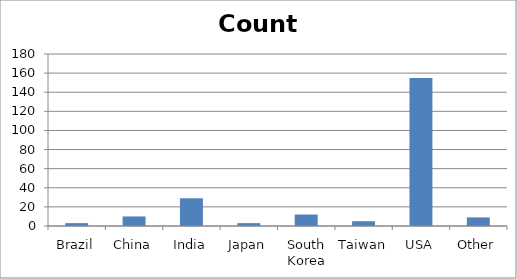
| Category | Count |
|---|---|
| Brazil | 3 |
| China | 10 |
| India | 29 |
| Japan | 3 |
| South Korea | 12 |
| Taiwan | 5 |
| USA | 155 |
| Other | 9 |